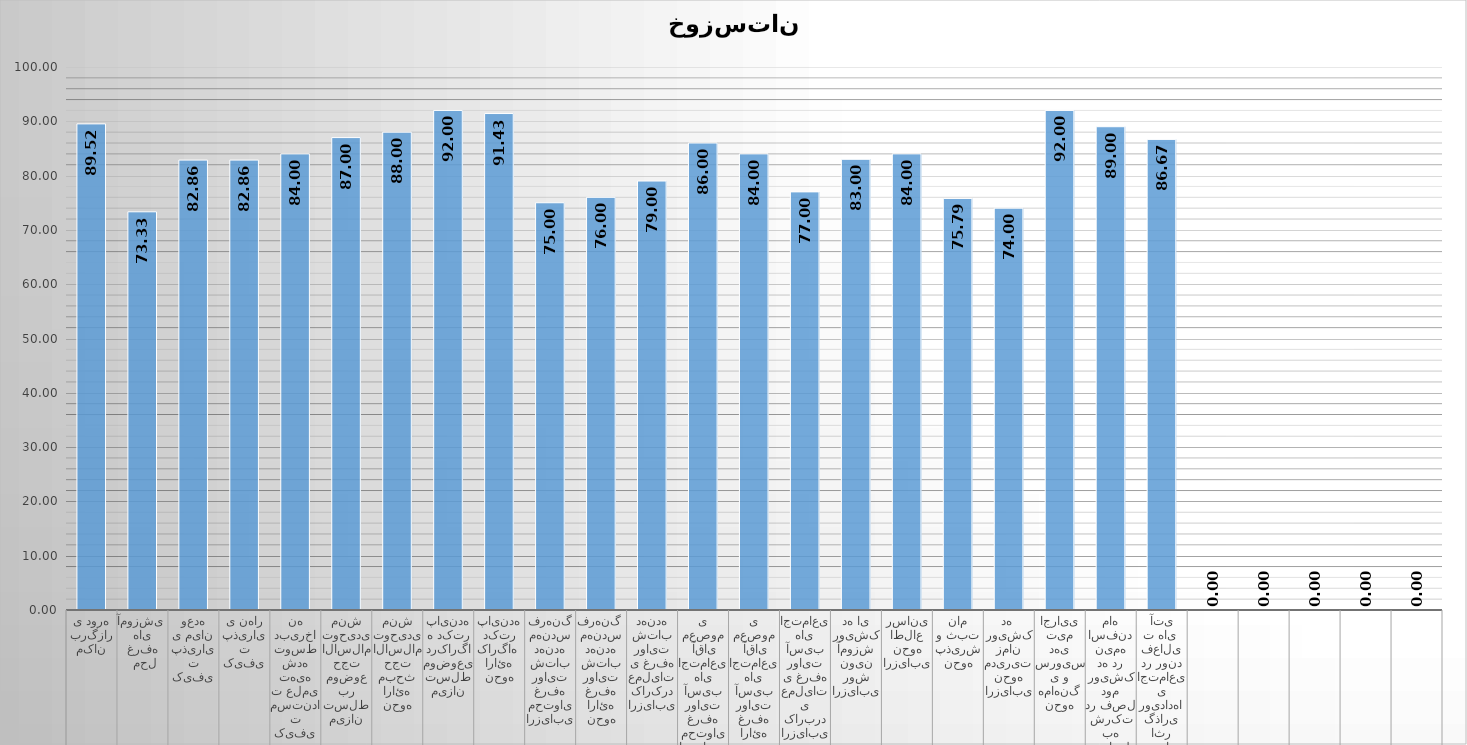
| Category | Series 0 |
|---|---|
| مکان برگزاری دوره | 89.524 |
|  محل غرفه های آموزشی  | 73.333 |
| کیفیت پذیرایی میان وعده | 82.857 |
| کیفیت پذیرایی نهار | 82.857 |
| کیفیت مستندات علمی تهیه شده توسط دبیرخانه | 84 |
| میزان تسلط بر موضوع حجت الاسلام توحیدی منش | 87 |
| نحوه ارائه مبحث حجت الاسلام توحیدی منش | 88 |
| میزان تسلط موضوعی درکارگاه دکتر پاینده | 92 |
| نحوه ارائه کارگاه  دکتر پاینده | 91.429 |
| ارزیابی محتوای غرفه روایت شتاب دهنده مهندس فرهنگ | 75 |
| نحوه ارائه غرفه روایت شتاب دهنده مهندس فرهنگ  | 76 |
| ارزیابی کارکرد عملیاتی غرفه روایت شتاب دهنده | 79 |
| ارزیابی محتوای غرفه روایت آسیب های اجتماعی  آقای معصومی | 86 |
| نحوه ارائه غرفه روایت آسیب های اجتماعی  آقای معصومی | 84 |
| ارزیابی کاربردی عملیاتی غرفه روایت آسیب های اجتماعی | 77 |
| ارزیابی روش نوین آموزش رویشکده ای | 83 |
| ارزیابی نحوه اطلاع رسانی | 84 |
| نحوه پذیرش و ثبت نام | 75.789 |
| ارزیابی نحوه مدیریت زمان رویشکده  | 74 |
| نحوه هماهنگی و سرویس دهی تیم اجرایی | 92 |
| تمایل به شرکت در فصل دوم رویشکده در نیمه اسفندماه | 89 |
| میزان اثر گذاری رویدادهای اجتماعی در روند فعالیت های  آتی | 86.667 |